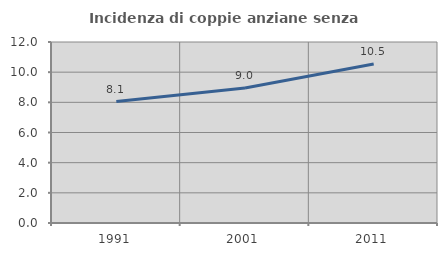
| Category | Incidenza di coppie anziane senza figli  |
|---|---|
| 1991.0 | 8.051 |
| 2001.0 | 8.954 |
| 2011.0 | 10.536 |